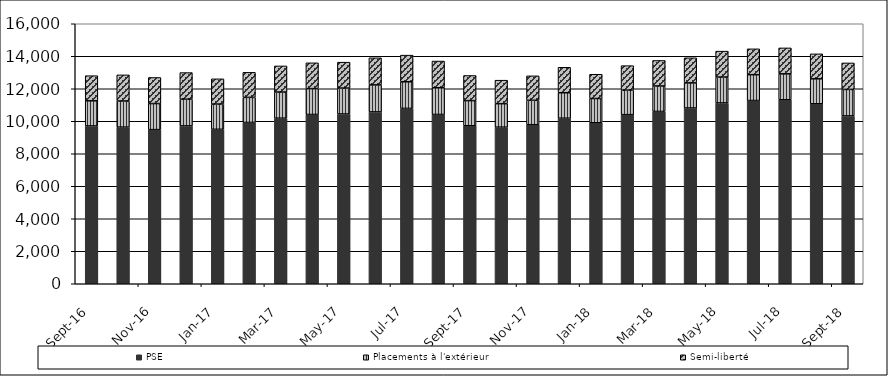
| Category | PSE | Placements à l'extérieur | Semi-liberté |
|---|---|---|---|
| 2016-09-01 | 9712 | 1546 | 1546 |
| 2016-10-01 | 9640 | 1607 | 1607 |
| 2016-11-01 | 9484 | 1605 | 1605 |
| 2016-12-01 | 9714 | 1641 | 1641 |
| 2017-01-01 | 9505 | 1553 | 1553 |
| 2017-02-01 | 9927 | 1542 | 1542 |
| 2017-03-01 | 10190 | 1607 | 1607 |
| 2017-04-01 | 10417 | 1590 | 1590 |
| 2017-05-01 | 10448 | 1594 | 1594 |
| 2017-06-01 | 10575 | 1664 | 1664 |
| 2017-07-01 | 10791 | 1639 | 1639 |
| 2017-08-01 | 10417 | 1644 | 1644 |
| 2017-09-01 | 9723 | 1547 | 1547 |
| 2017-10-01 | 9637 | 1445 | 1445 |
| 2017-11-01 | 9787 | 1504 | 1504 |
| 2017-12-01 | 10187 | 1568 | 1568 |
| 2018-01-01 | 9907 | 1493 | 1493 |
| 2018-02-01 | 10406 | 1508 | 1508 |
| 2018-03-01 | 10603 | 1569 | 1569 |
| 2018-04-01 | 10817 | 1544 | 1544 |
| 2018-05-01 | 11127 | 1594 | 1594 |
| 2018-06-01 | 11275 | 1591 | 1591 |
| 2018-07-01 | 11322 | 1596 | 1596 |
| 2018-08-01 | 11075 | 1537 | 1537 |
| 2018-09-01 | 10329 | 1630 | 1630 |